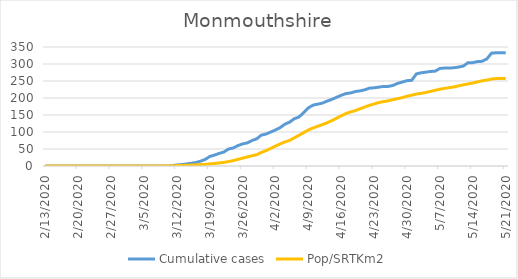
| Category | Cumulative cases | Pop/SRTKm2 |
|---|---|---|
| 5/21/20 | 333 | 257.276 |
| 5/20/20 | 333 | 257.276 |
| 5/19/20 | 333 | 257.215 |
| 5/18/20 | 332 | 255.805 |
| 5/17/20 | 315 | 252.803 |
| 5/16/20 | 308 | 250.567 |
| 5/15/20 | 307 | 247.425 |
| 5/14/20 | 304 | 243.939 |
| 5/13/20 | 304 | 241.522 |
| 5/12/20 | 294 | 238.742 |
| 5/11/20 | 291 | 235.982 |
| 5/10/20 | 289 | 232.557 |
| 5/9/20 | 288 | 230.563 |
| 5/8/20 | 288 | 228.065 |
| 5/7/20 | 287 | 226.05 |
| 5/6/20 | 279 | 222.726 |
| 5/5/20 | 278 | 219.402 |
| 5/4/20 | 276 | 216.199 |
| 5/3/20 | 274 | 213.621 |
| 5/2/20 | 271 | 211.727 |
| 5/1/20 | 252 | 208.363 |
| 4/30/20 | 251 | 205.18 |
| 4/29/20 | 247 | 201.312 |
| 4/28/20 | 243 | 198.028 |
| 4/27/20 | 237 | 195.087 |
| 4/26/20 | 234 | 191.783 |
| 4/25/20 | 234 | 189.386 |
| 4/24/20 | 232 | 186.666 |
| 4/23/20 | 230 | 182.496 |
| 4/22/20 | 229 | 178.507 |
| 4/21/20 | 224 | 173.451 |
| 4/20/20 | 221 | 168.354 |
| 4/19/20 | 219 | 162.814 |
| 4/18/20 | 215 | 159.228 |
| 4/17/20 | 213 | 154.333 |
| 4/16/20 | 208 | 147.846 |
| 4/15/20 | 202 | 140.614 |
| 4/14/20 | 196 | 133.463 |
| 4/13/20 | 191 | 127.218 |
| 4/12/20 | 185 | 121.839 |
| 4/11/20 | 182 | 116.943 |
| 4/10/20 | 179 | 112.028 |
| 4/9/20 | 171 | 105.984 |
| 4/8/20 | 157 | 98.128 |
| 4/7/20 | 144 | 90.412 |
| 4/6/20 | 139 | 82.837 |
| 4/5/20 | 129 | 75.202 |
| 4/4/20 | 123 | 70.75 |
| 4/3/20 | 113 | 65.089 |
| 4/2/20 | 106 | 58.562 |
| 4/1/20 | 100 | 51.854 |
| 3/31/20 | 94 | 45.407 |
| 3/30/20 | 91 | 39.948 |
| 3/29/20 | 80 | 33.22 |
| 3/28/20 | 75 | 30.077 |
| 3/27/20 | 68 | 26.733 |
| 3/26/20 | 65 | 23.006 |
| 3/25/20 | 60 | 19.501 |
| 3/24/20 | 53 | 15.814 |
| 3/23/20 | 50 | 13.094 |
| 3/22/20 | 41 | 10.476 |
| 3/21/20 | 37 | 8.945 |
| 3/20/20 | 32 | 7.434 |
| 3/19/20 | 28 | 5.983 |
| 3/18/20 | 19 | 4.774 |
| 3/17/20 | 14 | 4.069 |
| 3/16/20 | 10 | 3.324 |
| 3/15/20 | 8 | 2.639 |
| 3/14/20 | 6 | 2.055 |
| 3/13/20 | 4 | 1.672 |
| 3/12/20 | 3 | 1.128 |
| 3/11/20 | 1 | 0.645 |
| 3/10/20 | 0 | 0.363 |
| 3/9/20 | 0 | 0.141 |
| 3/8/20 | 0 | 0.081 |
| 3/7/20 | 0 | 0.081 |
| 3/6/20 | 0 | 0.04 |
| 3/5/20 | 0 | 0.04 |
| 3/4/20 | 0 | 0.04 |
| 3/3/20 | 0 | 0.02 |
| 3/2/20 | 0 | 0.02 |
| 3/1/20 | 0 | 0.02 |
| 2/29/20 | 0 | 0.02 |
| 2/28/20 | 0 | 0.02 |
| 2/27/20 | 0 | 0.02 |
| 2/26/20 | 0 | 0 |
| 2/25/20 | 0 | 0 |
| 2/24/20 | 0 | 0 |
| 2/23/20 | 0 | 0 |
| 2/22/20 | 0 | 0 |
| 2/21/20 | 0 | 0 |
| 2/20/20 | 0 | 0 |
| 2/19/20 | 0 | 0 |
| 2/18/20 | 0 | 0 |
| 2/17/20 | 0 | 0 |
| 2/16/20 | 0 | 0 |
| 2/15/20 | 0 | 0 |
| 2/14/20 | 0 | 0 |
| 2/13/20 | 0 | 0 |